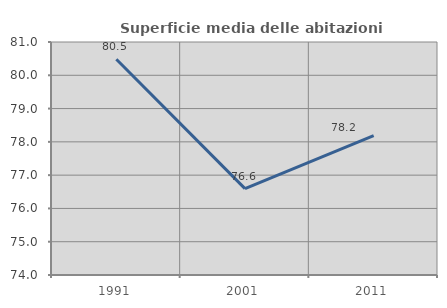
| Category | Superficie media delle abitazioni occupate |
|---|---|
| 1991.0 | 80.482 |
| 2001.0 | 76.596 |
| 2011.0 | 78.185 |